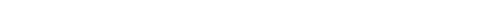
| Category | Series 0 | Series 1 |
|---|---|---|
| nan | 94.7 | 93.93 |
| 1.0 | 93.2 | 93.59 |
| 1.0 | 92.9 | 93.51 |
| 1.0 | 94.1 | 93.81 |
| nan | 94.2 | 94.16 |
| 2.0 | 94 | 94.12 |
| 2.0 | 94.3 | 93.74 |
| 2.0 | 93.1 | 93.29 |
| nan | 92.9 | 93.08 |
| 3.0 | 93.1 | 93.21 |
| 3.0 | 93.6 | 93.35 |
| 3.0 | 93.2 | 93.2 |
| nan | 92.6 | 92.73 |
| 4.0 | 92.6 | 92.23 |
| 4.0 | 91.5 | 91.95 |
| 4.0 | 92.3 | 92.17 |
| nan | 92.4 | 92.92 |
| 5.0 | 94.1 | 93.73 |
| 5.0 | 94 | 94.17 |
| 5.0 | 93.8 | 94.12 |
| nan | 94 | 93.74 |
| 6.0 | 93 | 93.28 |
| 6.0 | 92.9 | 92.94 |
| 6.0 | 92.9 | 92.78 |
| nan | 92.6 | 92.63 |
| 7.0 | 92.5 | 92.41 |
| 7.0 | 92.1 | 92.2 |
| 7.0 | 92.4 | 91.97 |
| nan | 92 | 91.82 |
| 8.0 | 91.3 | 91.78 |
| 8.0 | 92.4 | 91.71 |
| 8.0 | 90.9 | 91.5 |
| nan | 91.2 | 91.13 |
| 9.0 | 91 | 90.73 |
| 9.0 | 90.1 | 90.49 |
| 9.0 | 90.7 | 90.56 |
| nan | 91.1 | 90.95 |
| 10.0 | 91.2 | 91.36 |
| 10.0 | 91.7 | 91.52 |
| 10.0 | 91.6 | 91.39 |
| nan | 90.9 | 91.05 |
| 11.0 | 90.9 | 90.66 |
| 11.0 | 90 | 90.27 |
| 11.0 | 90 | 89.77 |
| nan | 88.7 | 89.21 |
| 12.0 | 88.6 | 88.75 |
| 12.0 | 88.6 | 88.5 |
| 12.0 | 88.2 | 88.57 |
| nan | 88.8 | 88.75 |
| 13.0 | 89.2 | 88.88 |
| 13.0 | 88.7 | 88.89 |
| 13.0 | 88.8 | 88.73 |
| nan | 88.5 | 88.36 |
| 14.0 | 87.4 | 87.83 |
| 14.0 | 87.7 | 87.36 |
| 14.0 | 87.1 | 87.18 |
| nan | 87.1 | 87.25 |
| 15.0 | 87.7 | 87.44 |
| 15.0 | 87.1 | 87.55 |
| 15.0 | 87.7 | 87.43 |
| nan | 87.2 | 87.21 |
| 16.0 | 87 | 87.06 |
| 16.0 | 87.4 | 87 |
| 16.0 | 87 | 86.86 |
| nan | 86.9 | 86.58 |
| 17.0 | 86.2 | 86.31 |
| 17.0 | 86.4 | 86.21 |
| 17.0 | 86.3 | 86.27 |
| nan | 86.2 | 86.35 |
| 18.0 | 86.4 | 86.37 |
| 18.0 | 85.9 | 86.39 |
| 18.0 | 86 | 86.36 |
| nan | 86.4 | 86.11 |
| 19.0 | 85.3 | 85.54 |
| 19.0 | 84.8 | 84.79 |
| 19.0 | 84.3 | 84.4 |
| nan | 84 | 84.72 |
| 20.0 | 86.1 | 85.48 |
| 20.0 | 86.2 | 86.12 |
| 20.0 | 86.4 | 86.37 |